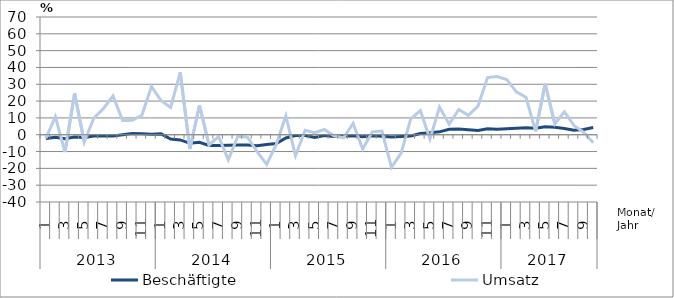
| Category | Beschäftigte | Umsatz |
|---|---|---|
| 0 | -2.3 | -2.2 |
| 1 | -1.5 | 10.7 |
| 2 | -2.4 | -10.3 |
| 3 | -1.3 | 24.6 |
| 4 | -1.6 | -4.4 |
| 5 | -0.7 | 9.9 |
| 6 | -0.8 | 15.6 |
| 7 | -0.8 | 23.1 |
| 8 | 0 | 8.4 |
| 9 | 0.7 | 8.6 |
| 10 | 0.6 | 11.5 |
| 11 | 0.3 | 28.7 |
| 12 | 0.5 | 20.3 |
| 13 | -2.6 | 16.2 |
| 14 | -3.1 | 37.1 |
| 15 | -5.1 | -8.5 |
| 16 | -4.5 | 17.4 |
| 17 | -6.4 | -6.1 |
| 18 | -6.4 | -1.1 |
| 19 | -6.2 | -14.9 |
| 20 | -6.1 | -0.9 |
| 21 | -6.1 | -1.5 |
| 22 | -6.6 | -10 |
| 23 | -5.8 | -17.6 |
| 24 | -5.2 | -5.7 |
| 25 | -1.9 | 11.2 |
| 26 | -0.5 | -12.5 |
| 27 | -0.5 | 2.7 |
| 28 | -1.7 | 1.2 |
| 29 | -0.5 | 3.1 |
| 30 | -1.1 | -0.6 |
| 31 | -0.8 | -1.8 |
| 32 | -0.6 | 6.7 |
| 33 | -1.2 | -8.6 |
| 34 | -0.6 | 1.7 |
| 35 | -0.9 | 2.2 |
| 36 | -1.3 | -19.4 |
| 37 | -1.1 | -10.9 |
| 38 | -0.8 | 9.4 |
| 39 | 0.7 | 14.4 |
| 40 | 1.2 | -2.6 |
| 41 | 1.7 | 16.5 |
| 42 | 3.2 | 6.3 |
| 43 | 3.4 | 15 |
| 44 | 3 | 11.5 |
| 45 | 2.5 | 17 |
| 46 | 3.6 | 34 |
| 47 | 3.2 | 34.6 |
| 48 | 3.5 | 32.8 |
| 49 | 3.8 | 25.5 |
| 50 | 4.2 | 22.3 |
| 51 | 3.9 | 2 |
| 52 | 4.7 | 30.3 |
| 53 | 4.4 | 6.4 |
| 54 | 3.7 | 13.6 |
| 55 | 2.7 | 5.5 |
| 56 | 3.1 | 1.5 |
| 57 | 4.3 | -4.7 |